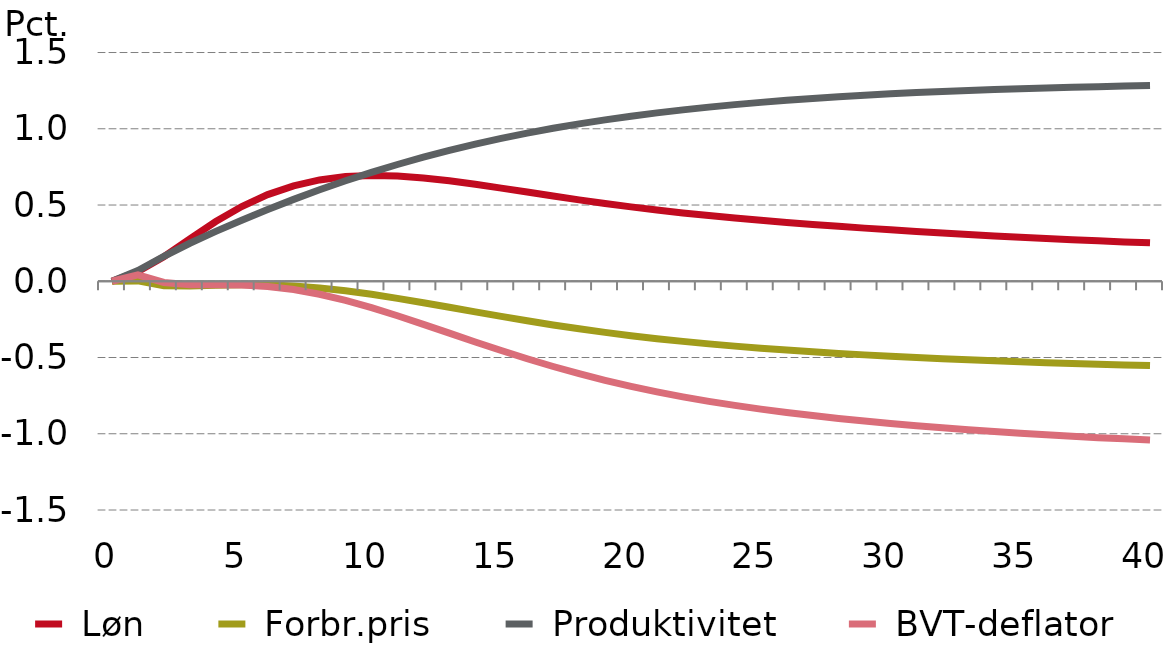
| Category |  Løn |  Forbr.pris |  Produktivitet |  BVT-deflator |
|---|---|---|---|---|
| 0.0 | 0 | 0 | 0 | 0 |
| nan | 0.063 | 0.002 | 0.07 | 0.041 |
| nan | 0.161 | -0.03 | 0.164 | -0.008 |
| nan | 0.278 | -0.031 | 0.249 | -0.023 |
| nan | 0.392 | -0.026 | 0.327 | -0.023 |
| 5.0 | 0.49 | -0.022 | 0.4 | -0.024 |
| nan | 0.568 | -0.023 | 0.471 | -0.034 |
| nan | 0.626 | -0.031 | 0.537 | -0.054 |
| nan | 0.664 | -0.044 | 0.6 | -0.085 |
| nan | 0.686 | -0.062 | 0.659 | -0.125 |
| 10.0 | 0.694 | -0.086 | 0.714 | -0.173 |
| nan | 0.69 | -0.112 | 0.766 | -0.226 |
| nan | 0.678 | -0.141 | 0.814 | -0.282 |
| nan | 0.659 | -0.171 | 0.858 | -0.34 |
| nan | 0.636 | -0.201 | 0.899 | -0.398 |
| 15.0 | 0.611 | -0.231 | 0.937 | -0.454 |
| nan | 0.585 | -0.259 | 0.971 | -0.508 |
| nan | 0.559 | -0.286 | 1.003 | -0.559 |
| nan | 0.534 | -0.312 | 1.032 | -0.606 |
| nan | 0.51 | -0.335 | 1.058 | -0.649 |
| 20.0 | 0.488 | -0.357 | 1.082 | -0.689 |
| nan | 0.467 | -0.376 | 1.104 | -0.725 |
| nan | 0.448 | -0.394 | 1.124 | -0.758 |
| nan | 0.431 | -0.411 | 1.142 | -0.787 |
| nan | 0.414 | -0.425 | 1.158 | -0.814 |
| 25.0 | 0.4 | -0.439 | 1.173 | -0.838 |
| nan | 0.386 | -0.451 | 1.187 | -0.861 |
| nan | 0.372 | -0.463 | 1.199 | -0.881 |
| nan | 0.36 | -0.473 | 1.21 | -0.9 |
| nan | 0.348 | -0.483 | 1.22 | -0.917 |
| 30.0 | 0.337 | -0.492 | 1.229 | -0.933 |
| nan | 0.327 | -0.5 | 1.237 | -0.947 |
| nan | 0.316 | -0.508 | 1.245 | -0.961 |
| nan | 0.307 | -0.515 | 1.251 | -0.974 |
| nan | 0.297 | -0.522 | 1.257 | -0.986 |
| 35.0 | 0.289 | -0.528 | 1.263 | -0.997 |
| nan | 0.28 | -0.534 | 1.268 | -1.007 |
| nan | 0.272 | -0.539 | 1.272 | -1.017 |
| nan | 0.265 | -0.544 | 1.276 | -1.025 |
| nan | 0.258 | -0.549 | 1.28 | -1.034 |
| 40.0 | 0.252 | -0.553 | 1.283 | -1.041 |